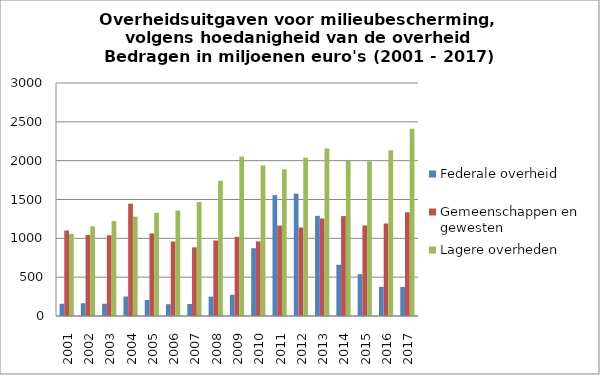
| Category | Federale overheid | Gemeenschappen en gewesten | Lagere overheden |
|---|---|---|---|
| 2001.0 | 157.2 | 1100.2 | 1057.5 |
| 2002.0 | 164.7 | 1044.2 | 1154.5 |
| 2003.0 | 157.2 | 1039.9 | 1222.2 |
| 2004.0 | 251 | 1446.2 | 1279.6 |
| 2005.0 | 206.8 | 1062.6 | 1327.9 |
| 2006.0 | 152.1 | 959.8 | 1357.7 |
| 2007.0 | 154.8 | 884.4 | 1466.9 |
| 2008.0 | 250.2 | 972.5 | 1741.5 |
| 2009.0 | 272.9 | 1019.1 | 2053.6 |
| 2010.0 | 872.3 | 960.7 | 1936.9 |
| 2011.0 | 1556.6 | 1163.9 | 1888.4 |
| 2012.0 | 1575.8 | 1139.1 | 2038.1 |
| 2013.0 | 1289.6 | 1254.8 | 2158.1 |
| 2014.0 | 660.3 | 1286.5 | 1995 |
| 2015.0 | 538.8 | 1165.7 | 1991.7 |
| 2016.0 | 376 | 1191.3 | 2135.7 |
| 2017.0 | 375.4 | 1335.4 | 2411.9 |